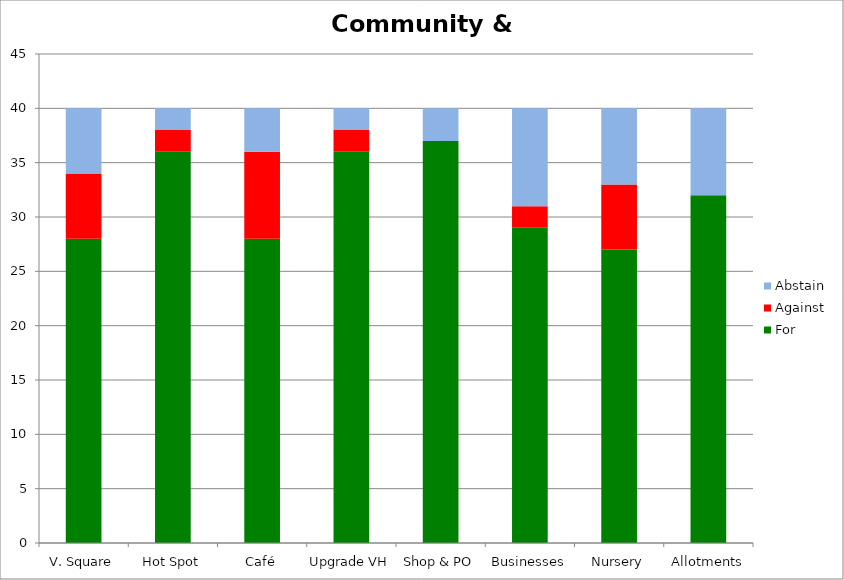
| Category | For | Against | Abstain |
|---|---|---|---|
| V. Square | 28 | 6 | 6 |
| Hot Spot | 36 | 2 | 2 |
| Café | 28 | 8 | 4 |
| Upgrade VH | 36 | 2 | 2 |
| Shop & PO | 37 | 0 | 3 |
| Businesses | 29 | 2 | 9 |
| Nursery | 27 | 6 | 7 |
| Allotments | 32 | 0 | 8 |